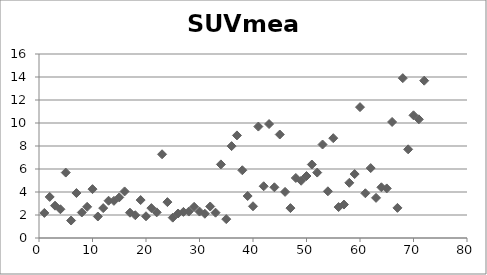
| Category | SUVmean |
|---|---|
| 1.0 | 2.18 |
| 2.0 | 3.57 |
| 3.0 | 2.81 |
| 4.0 | 2.5 |
| 5.0 | 5.69 |
| 6.0 | 1.52 |
| 7.0 | 3.91 |
| 8.0 | 2.22 |
| 9.0 | 2.71 |
| 10.0 | 4.25 |
| 11.0 | 1.87 |
| 12.0 | 2.6 |
| 13.0 | 3.24 |
| 14.0 | 3.23 |
| 15.0 | 3.53 |
| 16.0 | 4.05 |
| 17.0 | 2.2 |
| 18.0 | 1.98 |
| 19.0 | 3.3 |
| 20.0 | 1.89 |
| 21.0 | 2.6 |
| 22.0 | 2.23 |
| 23.0 | 7.28 |
| 24.0 | 3.12 |
| 25.0 | 1.77 |
| 26.0 | 2.13 |
| 27.0 | 2.27 |
| 28.0 | 2.3 |
| 29.0 | 2.71 |
| 30.0 | 2.3 |
| 31.0 | 2.11 |
| 32.0 | 2.74 |
| 33.0 | 2.2 |
| 34.0 | 6.4 |
| 35.0 | 1.64 |
| 36.0 | 7.99 |
| 37.0 | 8.92 |
| 38.0 | 5.89 |
| 39.0 | 3.65 |
| 40.0 | 2.76 |
| 41.0 | 9.69 |
| 42.0 | 4.5 |
| 43.0 | 9.91 |
| 44.0 | 4.41 |
| 45.0 | 9 |
| 46.0 | 4.01 |
| 47.0 | 2.6 |
| 48.0 | 5.22 |
| 49.0 | 4.98 |
| 50.0 | 5.39 |
| 51.0 | 6.39 |
| 52.0 | 5.69 |
| 53.0 | 8.13 |
| 54.0 | 4.06 |
| 55.0 | 8.68 |
| 56.0 | 2.69 |
| 57.0 | 2.91 |
| 58.0 | 4.8 |
| 59.0 | 5.56 |
| 60.0 | 11.38 |
| 61.0 | 3.89 |
| 62.0 | 6.08 |
| 63.0 | 3.49 |
| 64.0 | 4.41 |
| 65.0 | 4.31 |
| 66.0 | 10.09 |
| 67.0 | 2.62 |
| 68.0 | 13.9 |
| 69.0 | 7.71 |
| 70.0 | 10.67 |
| 71.0 | 10.32 |
| 72.0 | 13.68 |